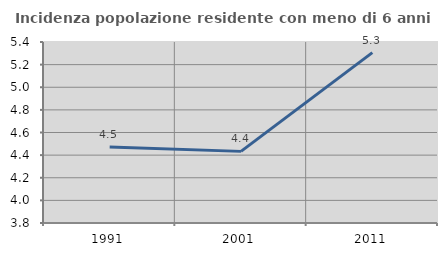
| Category | Incidenza popolazione residente con meno di 6 anni |
|---|---|
| 1991.0 | 4.471 |
| 2001.0 | 4.433 |
| 2011.0 | 5.306 |